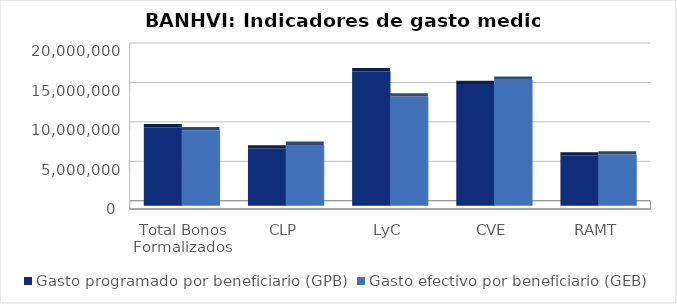
| Category | Gasto programado por beneficiario (GPB)  | Gasto efectivo por beneficiario (GEB)  |
|---|---|---|
| Total Bonos Formalizados | 9920024.654 | 9557415.979 |
| CLP | 7240213.243 | 7702753.237 |
| LyC | 17018417.915 | 13823216.207 |
| CVE | 15416870.536 | 15953290.064 |
| RAMT | 6358191.156 | 6469293.229 |